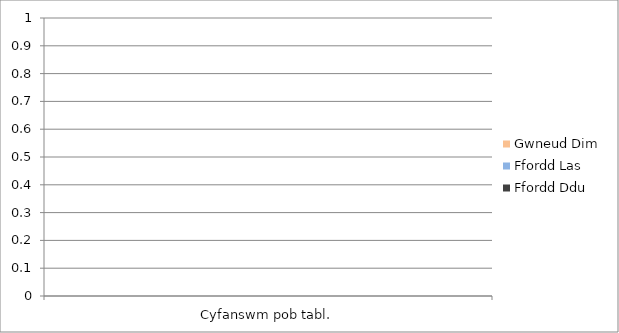
| Category | Gwneud Dim | Ffordd Las | Ffordd Ddu |
|---|---|---|---|
| 0 | 0 | 0 | 0 |